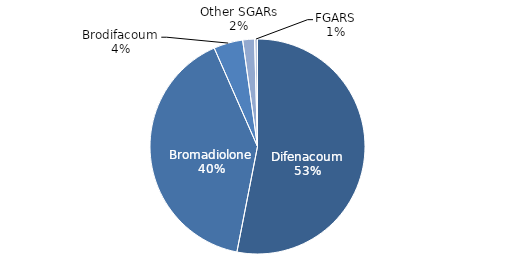
| Category | Series 0 |
|---|---|
| Difenacoum | 8391.504 |
| Bromadiolone | 6377.679 |
| Brodifacoum | 693.733 |
| Other SGARs | 281.171 |
| FGARS | 68.209 |